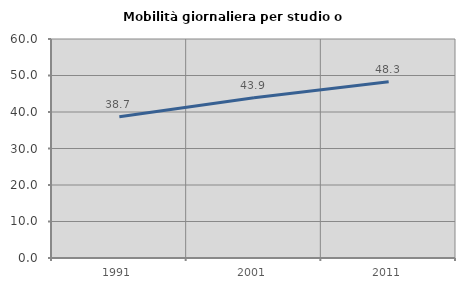
| Category | Mobilità giornaliera per studio o lavoro |
|---|---|
| 1991.0 | 38.674 |
| 2001.0 | 43.932 |
| 2011.0 | 48.269 |